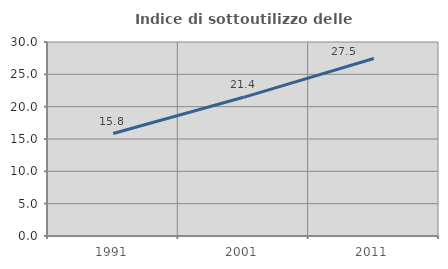
| Category | Indice di sottoutilizzo delle abitazioni  |
|---|---|
| 1991.0 | 15.844 |
| 2001.0 | 21.445 |
| 2011.0 | 27.452 |